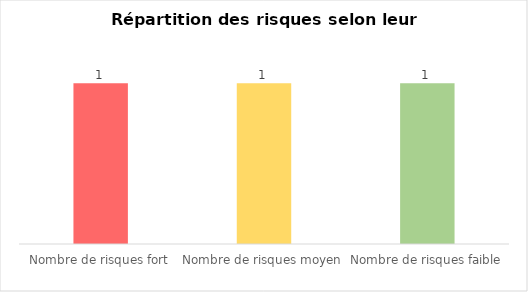
| Category | Series 0 |
|---|---|
| Nombre de risques fort | 1 |
| Nombre de risques moyen | 1 |
| Nombre de risques faible | 1 |